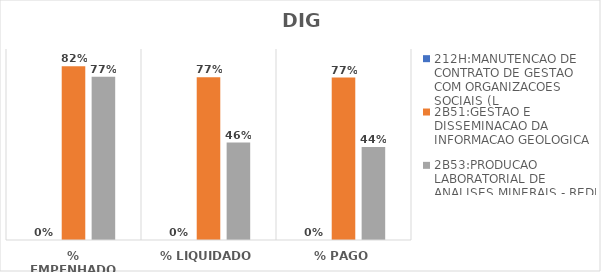
| Category | 212H:MANUTENCAO DE CONTRATO DE GESTAO COM ORGANIZACOES SOCIAIS (L | 2B51:GESTAO E DISSEMINACAO DA INFORMACAO GEOLOGICA | 2B53:PRODUCAO LABORATORIAL DE ANALISES MINERAIS - REDE LAMIN |
|---|---|---|---|
| % EMPENHADO | 0 | 0.818 | 0.769 |
| % LIQUIDADO | 0 | 0.767 | 0.459 |
| % PAGO | 0 | 0.765 | 0.438 |